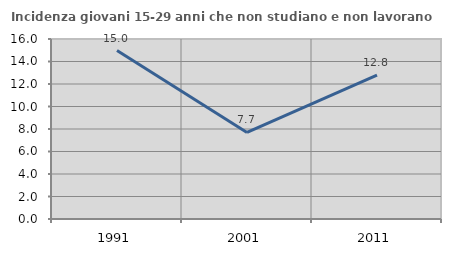
| Category | Incidenza giovani 15-29 anni che non studiano e non lavorano  |
|---|---|
| 1991.0 | 14.976 |
| 2001.0 | 7.692 |
| 2011.0 | 12.782 |